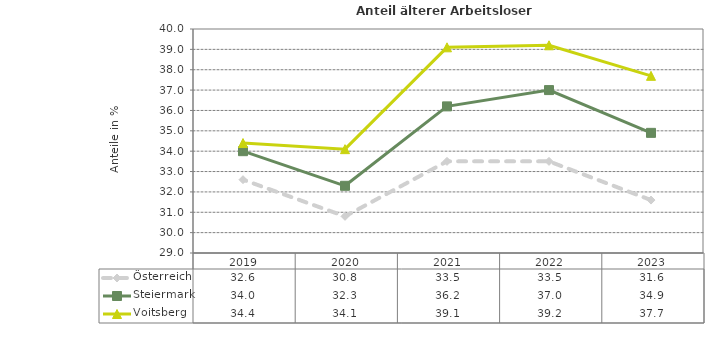
| Category | Österreich | Steiermark | Voitsberg |
|---|---|---|---|
| 2023.0 | 31.6 | 34.9 | 37.7 |
| 2022.0 | 33.5 | 37 | 39.2 |
| 2021.0 | 33.5 | 36.2 | 39.1 |
| 2020.0 | 30.8 | 32.3 | 34.1 |
| 2019.0 | 32.6 | 34 | 34.4 |